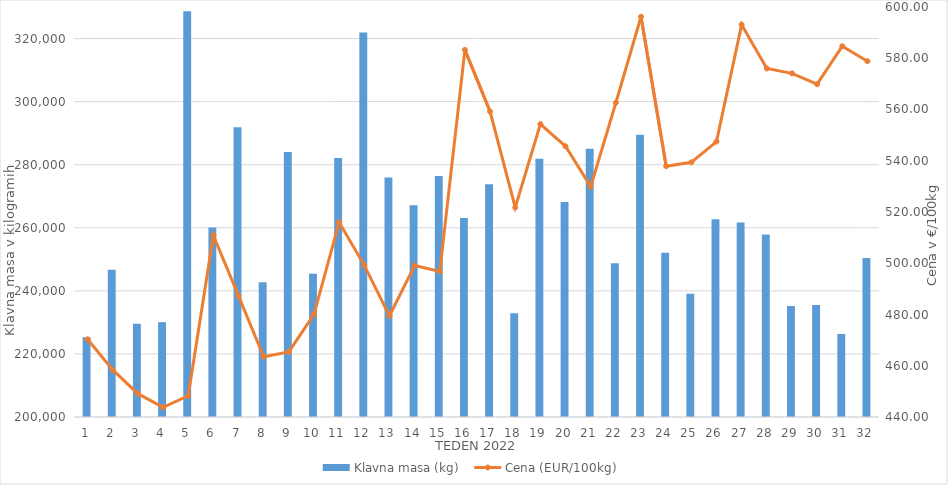
| Category | Klavna masa (kg) |
|---|---|
| 1.0 | 225300 |
| 2.0 | 246712 |
| 3.0 | 229541 |
| 4.0 | 230074 |
| 5.0 | 328640 |
| 6.0 | 260108 |
| 7.0 | 291887 |
| 8.0 | 242732 |
| 9.0 | 283987 |
| 10.0 | 245414 |
| 11.0 | 282092 |
| 12.0 | 321936 |
| 13.0 | 275950 |
| 14.0 | 267148 |
| 15.0 | 276417 |
| 16.0 | 263098 |
| 17.0 | 273824 |
| 18.0 | 232926 |
| 19.0 | 281859 |
| 20.0 | 268153 |
| 21.0 | 285073 |
| 22.0 | 248783 |
| 23.0 | 289478 |
| 24.0 | 252069 |
| 25.0 | 239099 |
| 26.0 | 262689 |
| 27.0 | 261656 |
| 28.0 | 257905 |
| 29.0 | 235185 |
| 30.0 | 235475 |
| 31.0 | 226322 |
| 32.0 | 250418 |